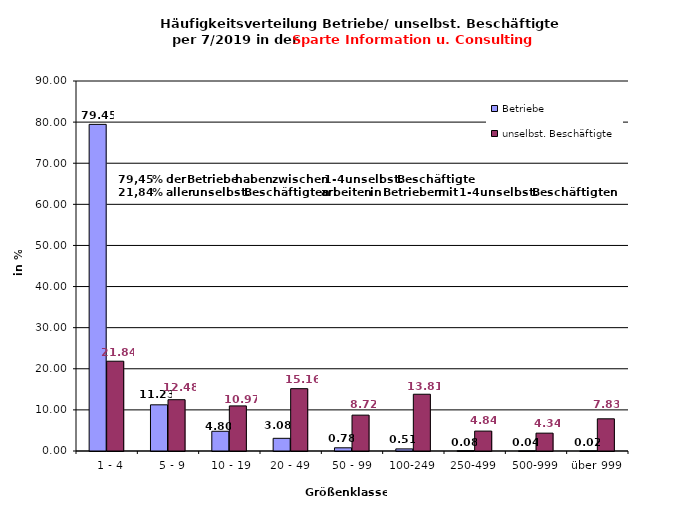
| Category | Betriebe | unselbst. Beschäftigte |
|---|---|---|
|   1 - 4 | 79.453 | 21.839 |
|   5 - 9 | 11.234 | 12.48 |
|  10 - 19 | 4.8 | 10.968 |
| 20 - 49 | 3.084 | 15.162 |
| 50 - 99 | 0.776 | 8.723 |
| 100-249 | 0.511 | 13.807 |
| 250-499 | 0.082 | 4.843 |
| 500-999 | 0.041 | 4.344 |
| über 999 | 0.02 | 7.833 |